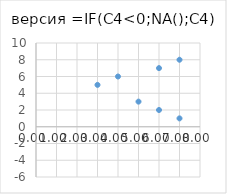
| Category | Series 0 |
|---|---|
| 7.0 | 1 |
| 6.0 | 2 |
| 7.0 | 8 |
| 6.0 | 7 |
| 5.0 | 3 |
| 4.0 | 6 |
| #N/A | -5 |
| 3.0 | 5 |